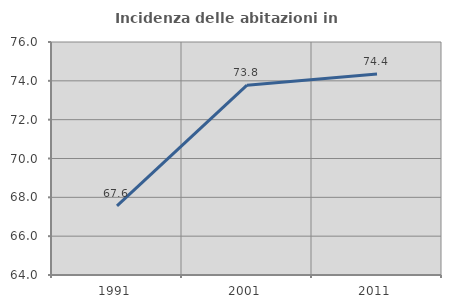
| Category | Incidenza delle abitazioni in proprietà  |
|---|---|
| 1991.0 | 67.56 |
| 2001.0 | 73.777 |
| 2011.0 | 74.354 |